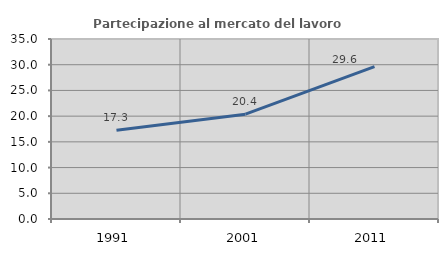
| Category | Partecipazione al mercato del lavoro  femminile |
|---|---|
| 1991.0 | 17.264 |
| 2001.0 | 20.377 |
| 2011.0 | 29.644 |